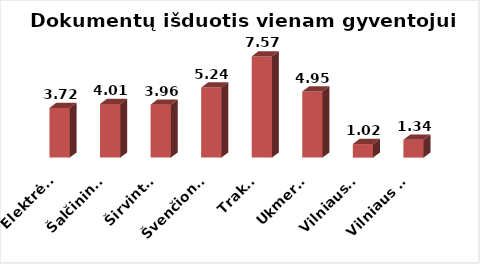
| Category | Series 0 |
|---|---|
|  Elektrėnai | 3.715 |
|  Šalčininkai | 4.011 |
|  Širvintos | 3.961 |
|  Švenčionys | 5.238 |
|  Trakai | 7.574 |
|  Ukmergė | 4.946 |
|  Vilniaus r. | 1.015 |
|  Vilniaus m. | 1.336 |